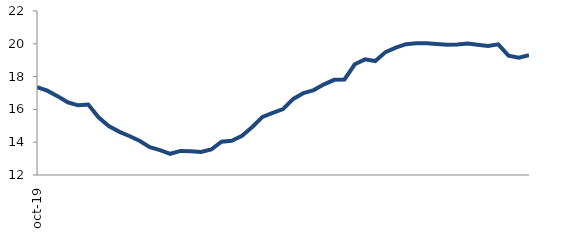
| Category | Series 0 |
|---|---|
| 2019-10-01 | 17.36 |
| 2019-11-01 | 17.14 |
| 2019-12-01 | 16.808 |
| 2020-01-01 | 16.434 |
| 2020-02-01 | 16.25 |
| 2020-03-01 | 16.293 |
| 2020-04-01 | 15.517 |
| 2020-05-01 | 14.987 |
| 2020-06-01 | 14.648 |
| 2020-07-01 | 14.379 |
| 2020-08-01 | 14.088 |
| 2020-09-01 | 13.698 |
| 2020-10-01 | 13.522 |
| 2020-11-01 | 13.294 |
| 2020-12-01 | 13.469 |
| 2021-01-01 | 13.453 |
| 2021-02-01 | 13.409 |
| 2021-03-01 | 13.556 |
| 2021-04-01 | 14.027 |
| 2021-05-01 | 14.092 |
| 2021-06-01 | 14.388 |
| 2021-07-01 | 14.927 |
| 2021-08-01 | 15.546 |
| 2021-09-01 | 15.791 |
| 2021-10-01 | 16.017 |
| 2021-11-01 | 16.641 |
| 2021-12-01 | 16.998 |
| 2022-01-01 | 17.179 |
| 2022-02-01 | 17.527 |
| 2022-03-01 | 17.804 |
| 2022-04-01 | 17.825 |
| 2022-05-01 | 18.751 |
| 2022-06-01 | 19.052 |
| 2022-07-01 | 18.945 |
| 2022-08-01 | 19.494 |
| 2022-09-01 | 19.767 |
| 2022-10-01 | 19.975 |
| 2022-11-01 | 20.037 |
| 2022-12-01 | 20.03 |
| 2023-01-01 | 19.993 |
| 2023-02-01 | 19.949 |
| 2023-03-01 | 19.953 |
| 2023-04-01 | 20.023 |
| 2023-05-01 | 19.94 |
| 2023-06-01 | 19.871 |
| 2023-07-01 | 19.969 |
| 2023-08-01 | 19.275 |
| 2023-09-01 | 19.157 |
| 2023-10-01 | 19.299 |